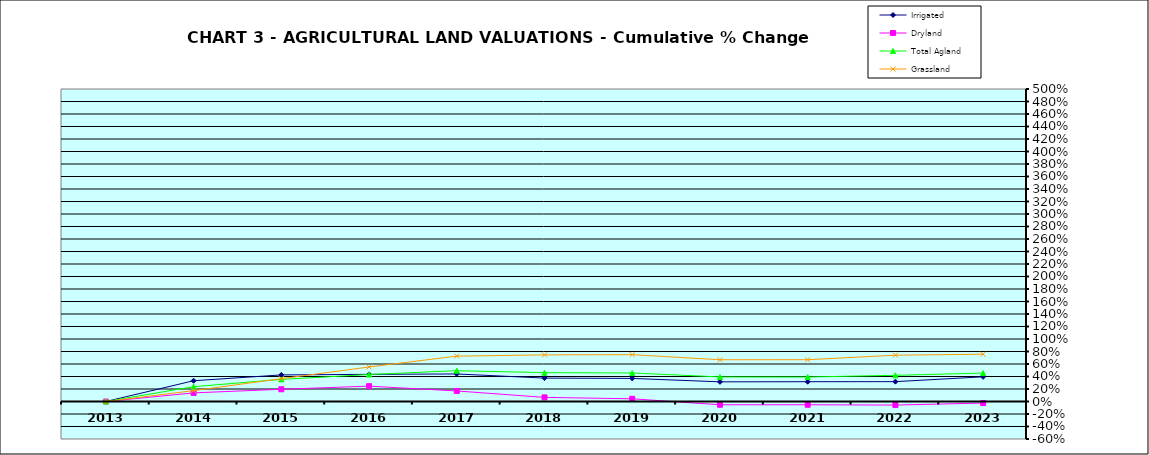
| Category | Irrigated | Dryland | Total Agland | Grassland |
|---|---|---|---|---|
| 2013.0 | 0 | 0 | 0 | 0 |
| 2014.0 | 0.332 | 0.138 | 0.237 | 0.174 |
| 2015.0 | 0.425 | 0.196 | 0.354 | 0.365 |
| 2016.0 | 0.434 | 0.246 | 0.431 | 0.552 |
| 2017.0 | 0.441 | 0.169 | 0.493 | 0.726 |
| 2018.0 | 0.374 | 0.066 | 0.461 | 0.746 |
| 2019.0 | 0.369 | 0.043 | 0.456 | 0.75 |
| 2020.0 | 0.314 | -0.052 | 0.393 | 0.668 |
| 2021.0 | 0.317 | -0.052 | 0.392 | 0.669 |
| 2022.0 | 0.318 | -0.057 | 0.419 | 0.741 |
| 2023.0 | 0.395 | -0.025 | 0.455 | 0.757 |